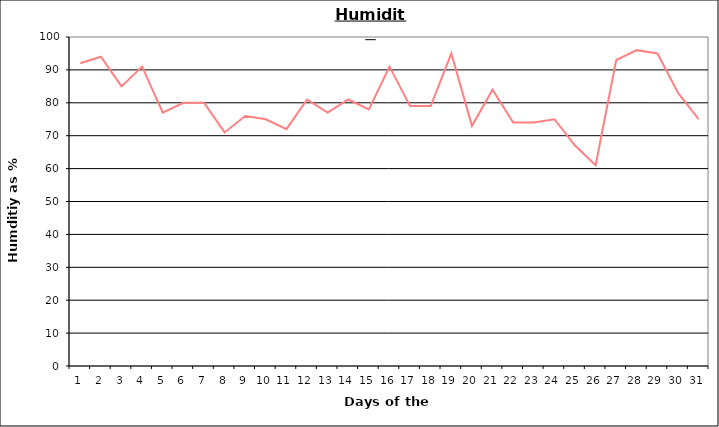
| Category | Series 0 |
|---|---|
| 0 | 92 |
| 1 | 94 |
| 2 | 85 |
| 3 | 91 |
| 4 | 77 |
| 5 | 80 |
| 6 | 80 |
| 7 | 71 |
| 8 | 76 |
| 9 | 75 |
| 10 | 72 |
| 11 | 81 |
| 12 | 77 |
| 13 | 81 |
| 14 | 78 |
| 15 | 91 |
| 16 | 79 |
| 17 | 79 |
| 18 | 95 |
| 19 | 73 |
| 20 | 84 |
| 21 | 74 |
| 22 | 74 |
| 23 | 75 |
| 24 | 67 |
| 25 | 61 |
| 26 | 93 |
| 27 | 96 |
| 28 | 95 |
| 29 | 83 |
| 30 | 75 |